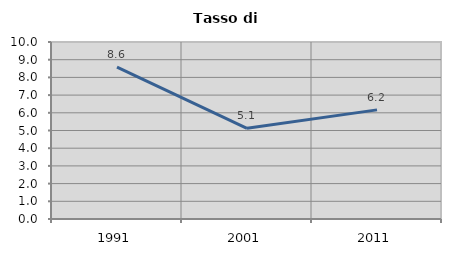
| Category | Tasso di disoccupazione   |
|---|---|
| 1991.0 | 8.585 |
| 2001.0 | 5.124 |
| 2011.0 | 6.166 |